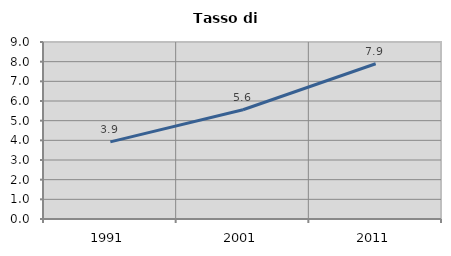
| Category | Tasso di disoccupazione   |
|---|---|
| 1991.0 | 3.922 |
| 2001.0 | 5.556 |
| 2011.0 | 7.895 |